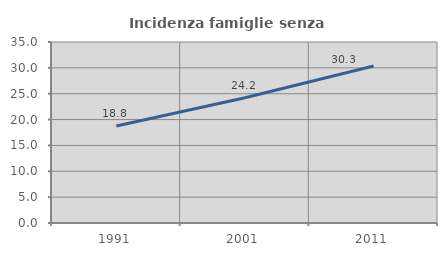
| Category | Incidenza famiglie senza nuclei |
|---|---|
| 1991.0 | 18.772 |
| 2001.0 | 24.204 |
| 2011.0 | 30.349 |